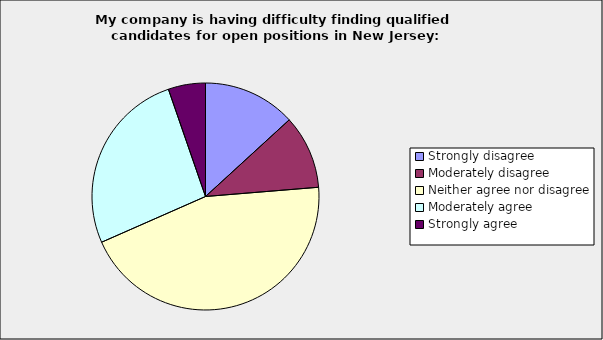
| Category | Series 0 |
|---|---|
| Strongly disagree | 0.132 |
| Moderately disagree | 0.105 |
| Neither agree nor disagree | 0.447 |
| Moderately agree | 0.263 |
| Strongly agree | 0.053 |